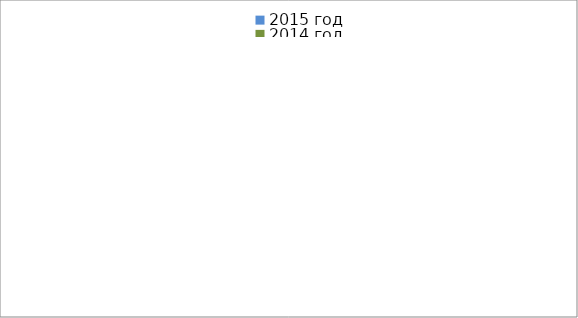
| Category | 2015 год | 2014 год |
|---|---|---|
|  - поджог | 0 | 0 |
|  - неосторожное обращение с огнём | 4 | 2 |
|  - НПТЭ электрооборудования | 0 | 0 |
|  - НПУ и Э печей | 5 | 3 |
|  - НПУ и Э транспортных средств | 1 | 5 |
|   -Шалость с огнем детей | 0 | 0 |
|  -НППБ при эксплуатации эл.приборов | 5 | 1 |
|  - курение | 0 | 1 |
| - прочие | 0 | 4 |
| - не установленные причины | 0 | 1 |